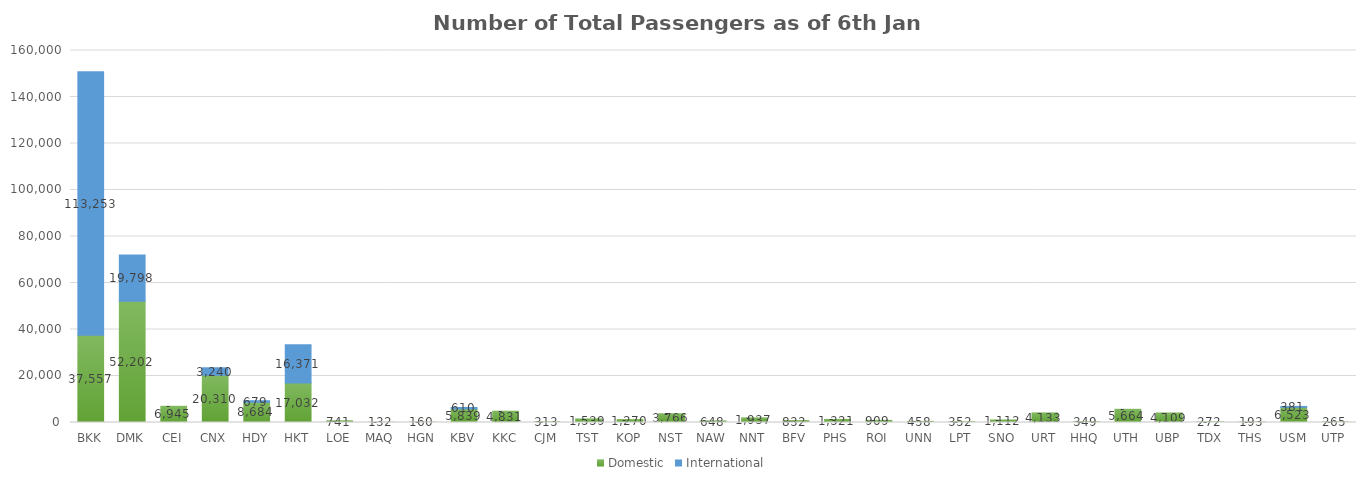
| Category | Domestic | International |
|---|---|---|
| BKK | 37557 | 113253 |
| DMK | 52202 | 19798 |
| CEI | 6945 | 0 |
| CNX | 20310 | 3240 |
| HDY | 8684 | 679 |
| HKT | 17032 | 16371 |
| LOE | 741 | 0 |
| MAQ | 132 | 0 |
| HGN | 160 | 0 |
| KBV | 5839 | 610 |
| KKC | 4831 | 0 |
| CJM | 313 | 0 |
| TST | 1539 | 0 |
| KOP | 1270 | 0 |
| NST | 3766 | 0 |
| NAW | 648 | 0 |
| NNT | 1937 | 0 |
| BFV | 832 | 0 |
| PHS | 1321 | 0 |
| ROI | 909 | 0 |
| UNN | 458 | 0 |
| LPT | 352 | 0 |
| SNO | 1112 | 0 |
| URT | 4133 | 0 |
| HHQ | 349 | 0 |
| UTH | 5664 | 0 |
| UBP | 4109 | 0 |
| TDX | 272 | 0 |
| THS | 193 | 0 |
| USM | 6523 | 381 |
| UTP | 265 | 0 |